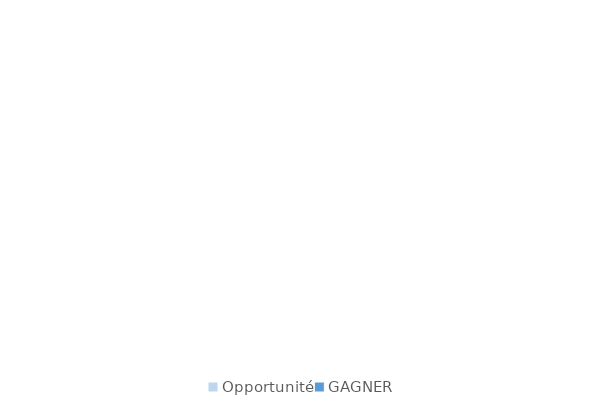
| Category | Series 0 |
|---|---|
| Opportunité | 0 |
| GAGNER | 0 |